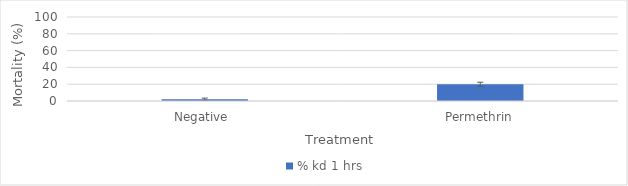
| Category | % kd 1 hrs |
|---|---|
| Negative  | 2.041 |
| Permethrin | 20 |